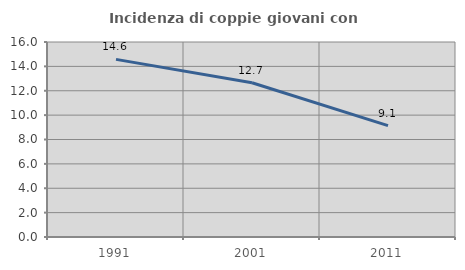
| Category | Incidenza di coppie giovani con figli |
|---|---|
| 1991.0 | 14.574 |
| 2001.0 | 12.653 |
| 2011.0 | 9.135 |